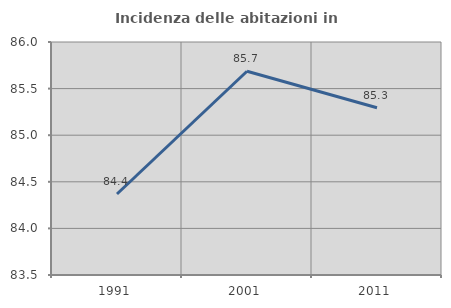
| Category | Incidenza delle abitazioni in proprietà  |
|---|---|
| 1991.0 | 84.369 |
| 2001.0 | 85.686 |
| 2011.0 | 85.294 |